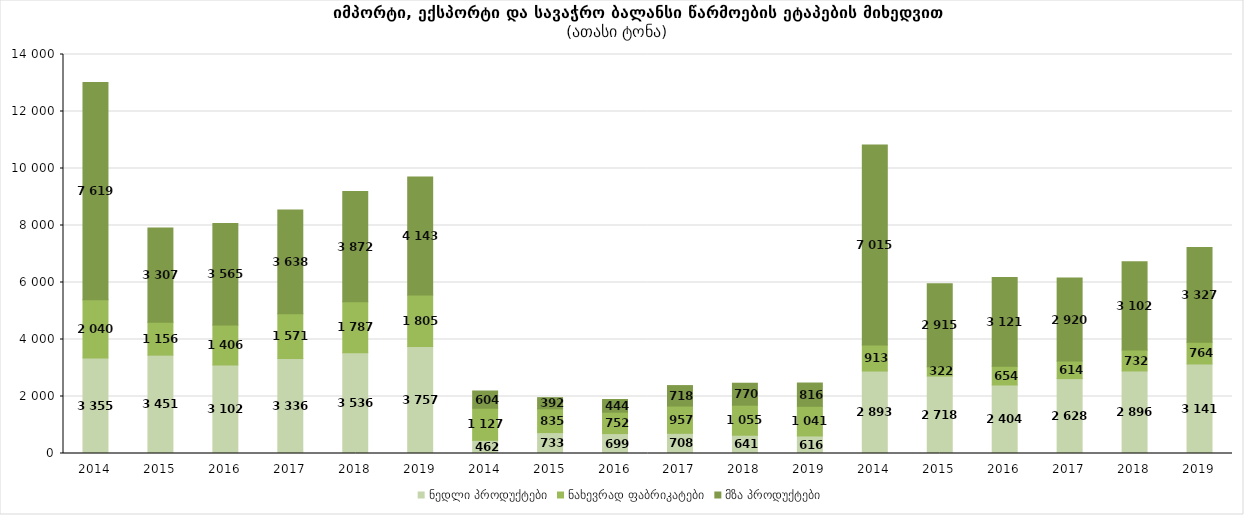
| Category | ნედლი პროდუქტები | ნახევრად ფაბრიკატები | მზა პროდუქტები |
|---|---|---|---|
| 2014.0 | 3355.2 | 2040 | 7618.8 |
| 2015.0 | 3451.2 | 1156.2 | 3307 |
| 2016.0 | 3102.3 | 1405.5 | 3564.8 |
| 2017.0 | 3335.6 | 1570.9 | 3638 |
| 2018.0 | 3536.4 | 1787 | 3872 |
| 2019.0 | 3757 | 1805 | 4143 |
| 2014.0 | 462.3 | 1126.9 | 603.6 |
| 2015.0 | 733.4 | 834.5 | 391.6 |
| 2016.0 | 698.5 | 751.5 | 444.2 |
| 2017.0 | 707.8 | 957.2 | 717.8 |
| 2018.0 | 640.6 | 1055.1 | 769.9 |
| 2019.0 | 616 | 1041 | 816 |
| 2014.0 | 2892.9 | 913.1 | 7015.2 |
| 2015.0 | 2717.8 | 321.7 | 2915.4 |
| 2016.0 | 2403.9 | 654 | 3120.7 |
| 2017.0 | 2627.8 | 613.7 | 2920.2 |
| 2018.0 | 2895.8 | 731.9 | 3102.1 |
| 2019.0 | 3141 | 764 | 3327 |